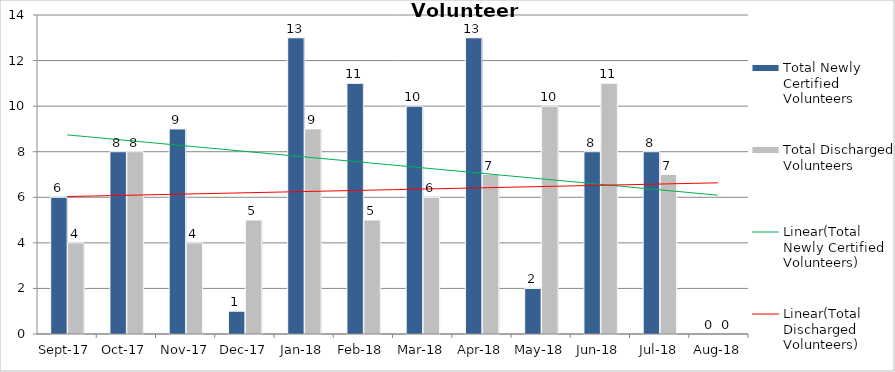
| Category | Total Newly Certified Volunteers | Total Discharged Volunteers |
|---|---|---|
| 2017-09-01 | 6 | 4 |
| 2017-10-01 | 8 | 8 |
| 2017-11-01 | 9 | 4 |
| 2017-12-01 | 1 | 5 |
| 2018-01-01 | 13 | 9 |
| 2018-02-01 | 11 | 5 |
| 2018-03-01 | 10 | 6 |
| 2018-04-01 | 13 | 7 |
| 2018-05-01 | 2 | 10 |
| 2018-06-01 | 8 | 11 |
| 2018-07-01 | 8 | 7 |
| 2018-08-01 | 0 | 0 |